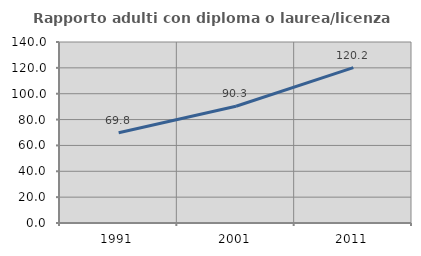
| Category | Rapporto adulti con diploma o laurea/licenza media  |
|---|---|
| 1991.0 | 69.775 |
| 2001.0 | 90.331 |
| 2011.0 | 120.163 |